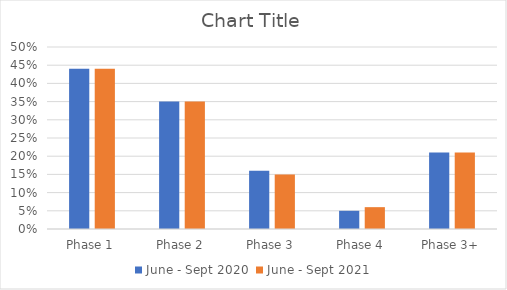
| Category | June - Sept 2020 | June - Sept 2021 |
|---|---|---|
| Phase 1 | 0.44 | 0.44 |
| Phase 2 | 0.35 | 0.35 |
| Phase 3 | 0.16 | 0.15 |
| Phase 4 | 0.05 | 0.06 |
| Phase 3+ | 0.21 | 0.21 |